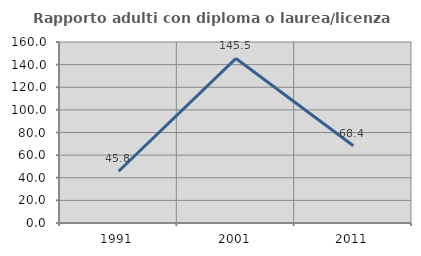
| Category | Rapporto adulti con diploma o laurea/licenza media  |
|---|---|
| 1991.0 | 45.763 |
| 2001.0 | 145.455 |
| 2011.0 | 68.354 |